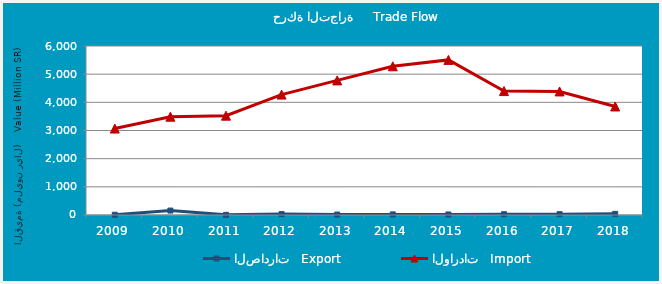
| Category | الصادرات   Export | الواردات   Import |
|---|---|---|
| 2009.0 | 9110134 | 3069004269 |
| 2010.0 | 157106998 | 3490356155 |
| 2011.0 | 5368256 | 3526623001 |
| 2012.0 | 32728742 | 4274560870 |
| 2013.0 | 16482094 | 4779568784 |
| 2014.0 | 21244377 | 5279323089 |
| 2015.0 | 18866837 | 5506446612 |
| 2016.0 | 27968292 | 4400121353 |
| 2017.0 | 30334969 | 4387191427 |
| 2018.0 | 40558390 | 3852777124 |